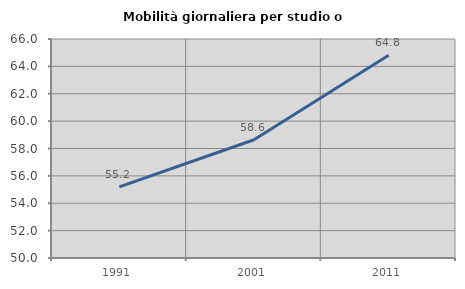
| Category | Mobilità giornaliera per studio o lavoro |
|---|---|
| 1991.0 | 55.193 |
| 2001.0 | 58.639 |
| 2011.0 | 64.818 |